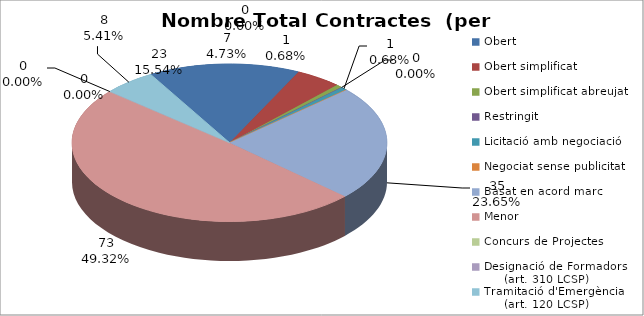
| Category | Nombre Total Contractes |
|---|---|
| Obert | 23 |
| Obert simplificat | 7 |
| Obert simplificat abreujat | 1 |
| Restringit | 0 |
| Licitació amb negociació | 1 |
| Negociat sense publicitat | 0 |
| Basat en acord marc | 35 |
| Menor | 73 |
| Concurs de Projectes | 0 |
| Designació de Formadors
     (art. 310 LCSP) | 0 |
| Tramitació d'Emergència
     (art. 120 LCSP) | 8 |